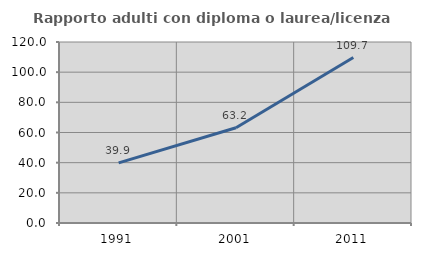
| Category | Rapporto adulti con diploma o laurea/licenza media  |
|---|---|
| 1991.0 | 39.901 |
| 2001.0 | 63.158 |
| 2011.0 | 109.677 |